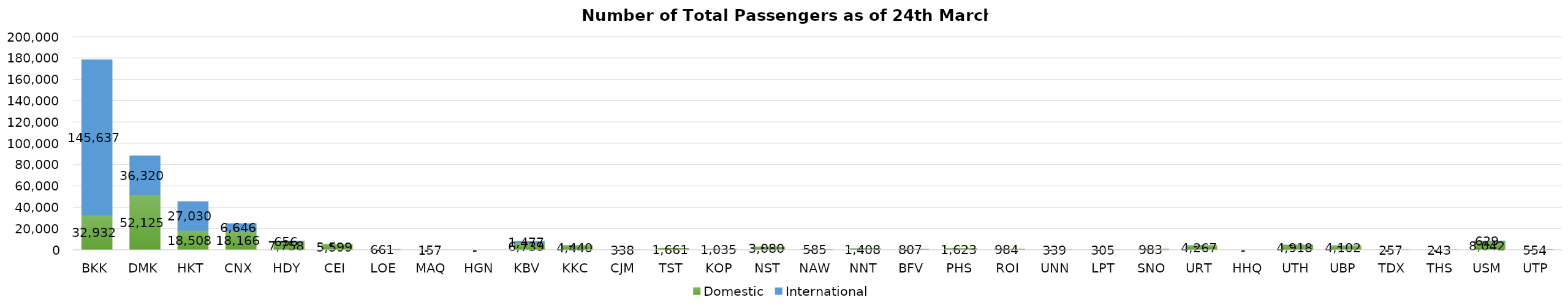
| Category | Domestic | International |
|---|---|---|
| BKK | 32932 | 145637 |
| DMK | 52125 | 36320 |
| HKT | 18508 | 27030 |
| CNX | 18166 | 6646 |
| HDY | 7758 | 656 |
| CEI | 5599 | 0 |
| LOE | 661 | 0 |
| MAQ | 157 | 0 |
| HGN | 0 | 0 |
| KBV | 6739 | 1477 |
| KKC | 4440 | 0 |
| CJM | 338 | 0 |
| TST | 1661 | 0 |
| KOP | 1035 | 0 |
| NST | 3080 | 0 |
| NAW | 585 | 0 |
| NNT | 1408 | 0 |
| BFV | 807 | 0 |
| PHS | 1623 | 0 |
| ROI | 984 | 0 |
| UNN | 339 | 0 |
| LPT | 305 | 0 |
| SNO | 983 | 0 |
| URT | 4267 | 0 |
| HHQ | 0 | 0 |
| UTH | 4918 | 0 |
| UBP | 4102 | 0 |
| TDX | 257 | 0 |
| THS | 243 | 0 |
| USM | 8042 | 629 |
| UTP | 554 | 0 |